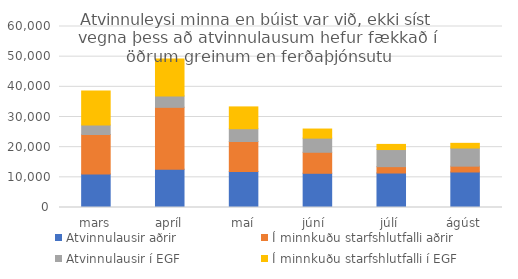
| Category | Atvinnulausir aðrir | Í minnkuðu starfshlutfalli aðrir | Atvinnulausir í EGF | Í minnkuðu starfshlutfalli í EGF |
|---|---|---|---|---|
| mars | 11104 | 13091 | 3117 | 11308 |
| apríl | 12651 | 20552 | 3792 | 12250 |
| maí | 11897 | 9982 | 4237 | 7231 |
| júní  | 11340 | 6971 | 4688 | 3013 |
| júlí | 11431 | 2108 | 5673 | 1703 |
| ágúst | 11772 | 1930 | 6016 | 1553 |